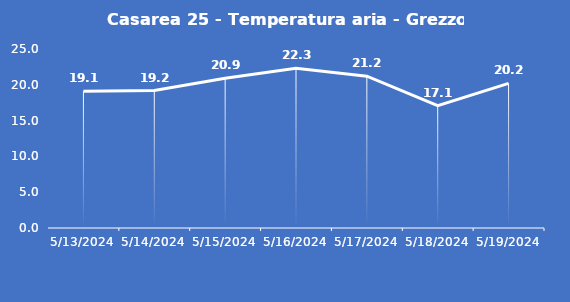
| Category | Casarea 25 - Temperatura aria - Grezzo (°C) |
|---|---|
| 5/13/24 | 19.1 |
| 5/14/24 | 19.2 |
| 5/15/24 | 20.9 |
| 5/16/24 | 22.3 |
| 5/17/24 | 21.2 |
| 5/18/24 | 17.1 |
| 5/19/24 | 20.2 |